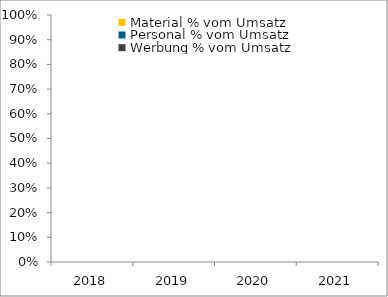
| Category | Material % vom Umsatz | Personal % vom Umsatz | Werbung % vom Umsatz |
|---|---|---|---|
| 2018.0 | 0 | 0 | 0 |
| 2019.0 | 0 | 0 | 0 |
| 2020.0 | 0 | 0 | 0 |
| 2021.0 | 0 | 0 | 0 |